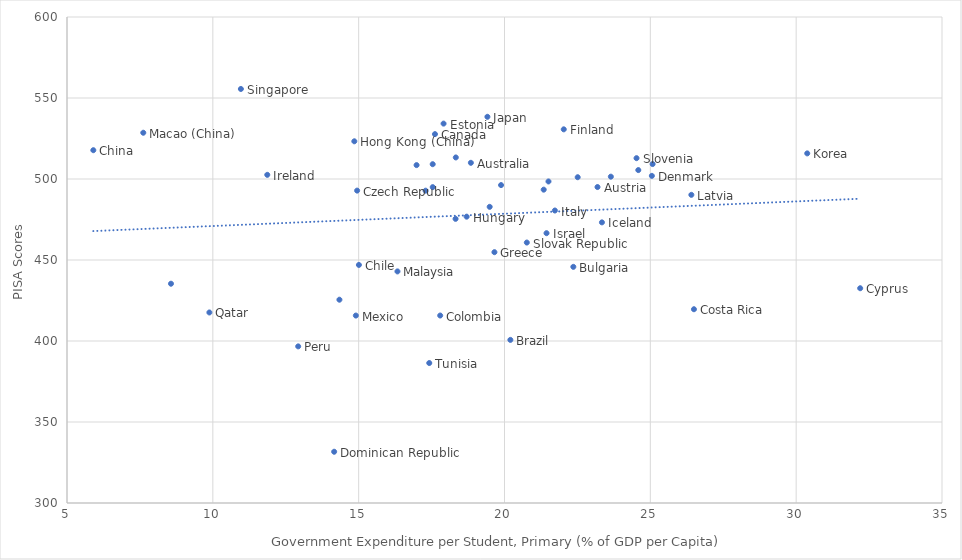
| Category | Series 0 |
|---|---|
| 18.8469295501709 | 509.994 |
| 23.1886596679688 | 495.037 |
| 20.2011394500732 | 400.682 |
| 22.3601608276367 | 445.772 |
| 17.615909576416 | 527.705 |
| 15.0078601837158 | 446.956 |
| 5.90241003036499 | 517.779 |
| 17.79541015625 | 415.729 |
| 26.4952697753906 | 419.608 |
| 32.1951713562012 | 432.577 |
| 14.9471797943115 | 492.83 |
| 25.0524597167969 | 501.937 |
| 14.1597700119019 | 331.639 |
| 17.9109497070313 | 534.194 |
| 22.0318698883057 | 530.661 |
| 17.5395793914795 | 494.978 |
| 17.5384197235107 | 509.141 |
| 19.6548309326172 | 454.829 |
| 14.8510704040527 | 523.277 |
| 18.7017192840576 | 476.748 |
| 23.3406505584717 | 473.23 |
| 11.8668003082275 | 502.575 |
| 21.4409103393555 | 466.553 |
| 21.7273502349854 | 480.547 |
| 19.414400100708 | 538.395 |
| 30.3795795440674 | 515.81 |
| 26.4067897796631 | 490.225 |
| 18.3222198486328 | 475.409 |
| 19.4918403625488 | 482.806 |
| 7.61520004272461 | 528.55 |
| 16.3302707672119 | 442.948 |
| 14.9032697677612 | 415.71 |
| 16.9853401184082 | 508.575 |
| 18.3304100036621 | 513.304 |
| 21.5078296661377 | 498.481 |
| 12.9266700744629 | 396.684 |
| 23.6464290618896 | 501.435 |
| 22.5095691680908 | 501.1 |
| 9.88150978088379 | 417.611 |
| 10.9616003036499 | 555.575 |
| 20.7648696899414 | 460.775 |
| 24.5265998840332 | 512.864 |
| 17.2945499420166 | 492.786 |
| 21.3442897796631 | 493.422 |
| 24.5876197814941 | 505.506 |
| 17.4204902648926 | 386.403 |
| 14.3401699066162 | 425.49 |
| 25.0778408050537 | 509.222 |
| 19.8821105957031 | 496.242 |
| 8.5651503 | 435.363 |